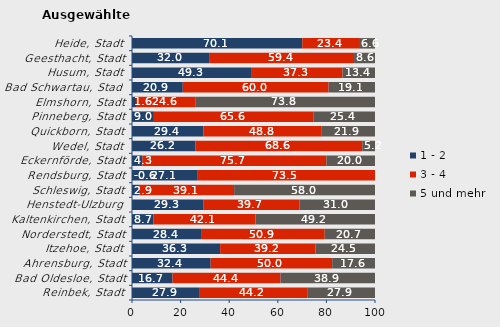
| Category | 1 - 2 | 3 - 4 | 5 und mehr |
|---|---|---|---|
| Reinbek, Stadt | 27.907 | 44.186 | 27.907 |
| Bad Oldesloe, Stadt | 16.667 | 44.444 | 38.889 |
| Ahrensburg, Stadt | 32.381 | 50 | 17.619 |
| Itzehoe, Stadt | 36.275 | 39.216 | 24.51 |
| Norderstedt, Stadt | 28.414 | 50.897 | 20.69 |
| Kaltenkirchen, Stadt | 8.743 | 42.077 | 49.18 |
| Henstedt-Ulzburg | 29.31 | 39.655 | 31.034 |
| Schleswig, Stadt | 2.899 | 39.13 | 57.971 |
| Rendsburg, Stadt | 27.072 | 73.481 | -0.552 |
| Eckernförde, Stadt | 4.286 | 75.714 | 20 |
| Wedel, Stadt | 26.163 | 68.605 | 5.233 |
| Quickborn, Stadt | 29.353 | 48.756 | 21.891 |
| Pinneberg, Stadt | 9.016 | 65.574 | 25.41 |
| Elmshorn, Stadt | 1.639 | 24.59 | 73.77 |
| Bad Schwartau, Stadt | 20.909 | 60 | 19.091 |
| Husum, Stadt | 49.309 | 37.327 | 13.364 |
| Geesthacht, Stadt | 32 | 59.385 | 8.615 |
| Heide, Stadt | 70.06 | 23.353 | 6.587 |